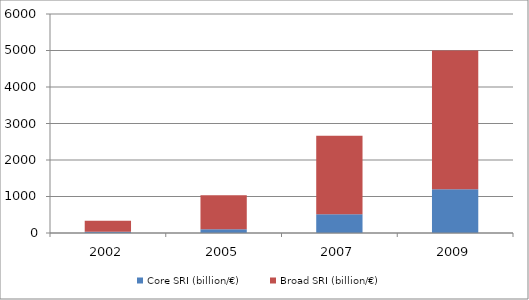
| Category | Core SRI (billion/€) | Broad SRI (billion/€) |
|---|---|---|
| 2002.0 | 34 | 302 |
| 2005.0 | 105 | 928 |
| 2007.0 | 512 | 2154 |
| 2009.0 | 1200 | 3800 |